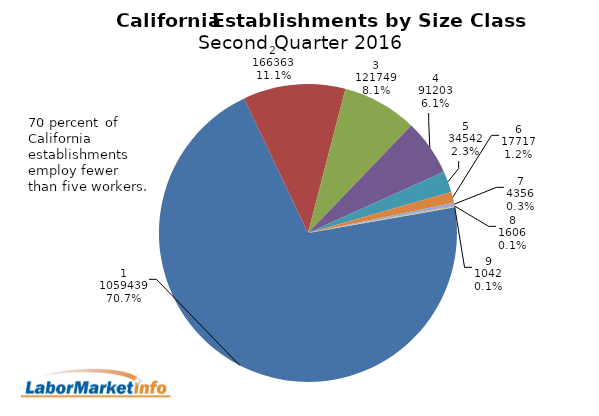
| Category | Series 1 |
|---|---|
| 0 | 1059439 |
| 1 | 166363 |
| 2 | 121749 |
| 3 | 91203 |
| 4 | 34542 |
| 5 | 17717 |
| 6 | 4356 |
| 7 | 1606 |
| 8 | 1042 |